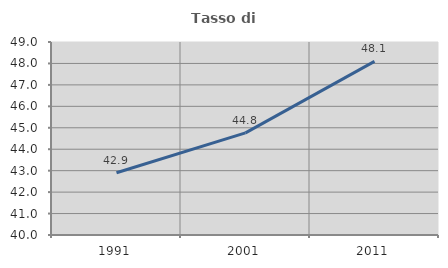
| Category | Tasso di occupazione   |
|---|---|
| 1991.0 | 42.901 |
| 2001.0 | 44.76 |
| 2011.0 | 48.098 |